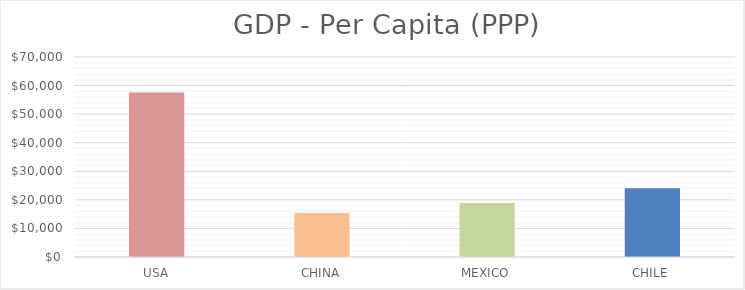
| Category | GDP - Per Capita (PPP) |
|---|---|
| USA | 57600 |
| CHINA | 15400 |
| MEXICO | 18900 |
| CHILE | 24100 |